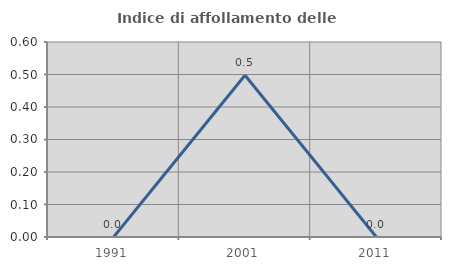
| Category | Indice di affollamento delle abitazioni  |
|---|---|
| 1991.0 | 0 |
| 2001.0 | 0.498 |
| 2011.0 | 0 |